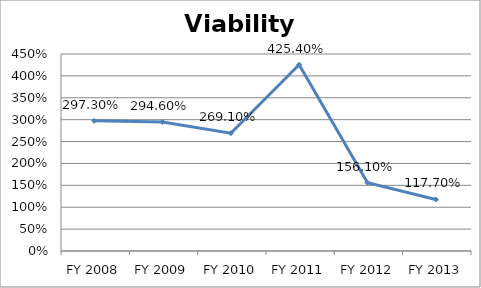
| Category | Viability ratio |
|---|---|
| FY 2013 | 1.177 |
| FY 2012 | 1.561 |
| FY 2011 | 4.254 |
| FY 2010 | 2.691 |
| FY 2009 | 2.946 |
| FY 2008 | 2.973 |